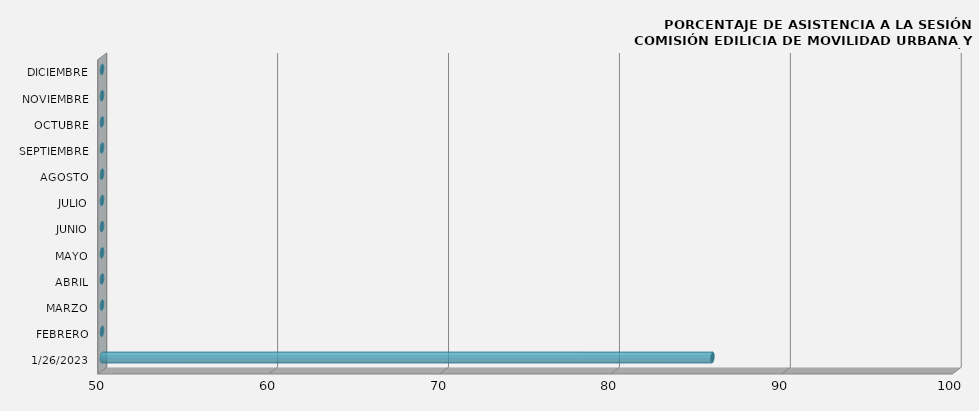
| Category | Series 0 |
|---|---|
| 26/01/2023 | 85.714 |
| FEBRERO | 0 |
| MARZO | 0 |
| ABRIL | 0 |
| MAYO | 0 |
| JUNIO | 0 |
| JULIO | 0 |
| AGOSTO | 0 |
| SEPTIEMBRE | 0 |
| OCTUBRE | 0 |
| NOVIEMBRE | 0 |
| DICIEMBRE | 0 |